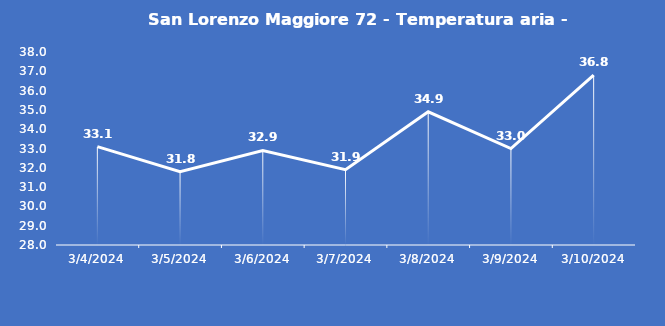
| Category | San Lorenzo Maggiore 72 - Temperatura aria - Grezzo (°C) |
|---|---|
| 3/4/24 | 33.1 |
| 3/5/24 | 31.8 |
| 3/6/24 | 32.9 |
| 3/7/24 | 31.9 |
| 3/8/24 | 34.9 |
| 3/9/24 | 33 |
| 3/10/24 | 36.8 |